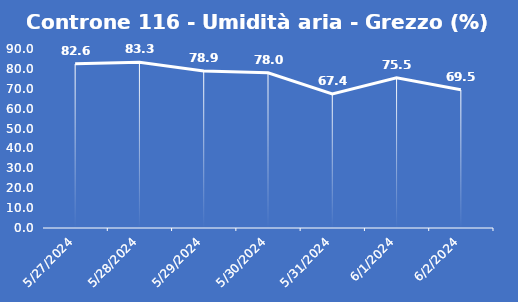
| Category | Controne 116 - Umidità aria - Grezzo (%) |
|---|---|
| 5/27/24 | 82.6 |
| 5/28/24 | 83.3 |
| 5/29/24 | 78.9 |
| 5/30/24 | 78 |
| 5/31/24 | 67.4 |
| 6/1/24 | 75.5 |
| 6/2/24 | 69.5 |